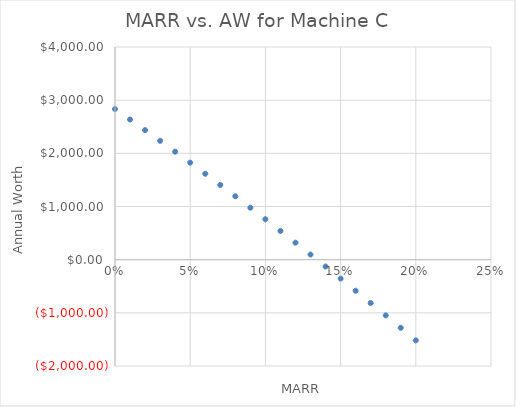
| Category | Series 0 |
|---|---|
| 0.0 | 2833.333 |
| 0.01 | 2636.291 |
| 0.02 | 2436.855 |
| 0.03 | 2235.062 |
| 0.04 | 2030.952 |
| 0.05 | 1824.563 |
| 0.06 | 1615.934 |
| 0.07 | 1405.105 |
| 0.08 | 1192.115 |
| 0.09 | 977.005 |
| 0.1 | 759.815 |
| 0.11 | 540.586 |
| 0.12 | 319.357 |
| 0.13 | 96.169 |
| 0.14 | -128.937 |
| 0.15 | -355.923 |
| 0.16 | -584.747 |
| 0.17 | -815.37 |
| 0.18 | -1047.753 |
| 0.19 | -1281.857 |
| 0.2 | -1517.644 |